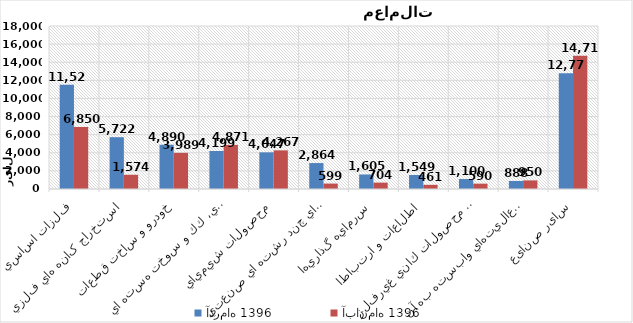
| Category | آذر‌ماه 1396 | آبان‌ماه 1396 |
|---|---|---|
| فلزات اساسي | 11522.234 | 6850.494 |
| استخراج کانه هاي فلزي | 5722.241 | 1573.636 |
| خودرو و ساخت قطعات | 4889.731 | 3989.436 |
| فراورده هاي نفتي، كك و سوخت هسته اي | 4198.873 | 4871.484 |
| محصولات شيميايي | 4047.029 | 4266.772 |
| شرکتهاي چند رشته اي صنعتي | 2864.365 | 598.634 |
| سرمايه گذاريها | 1604.502 | 704.174 |
| اطلاعات و ارتباطات | 1548.641 | 461.483 |
| ساير محصولات كاني غيرفلزي | 1099.518 | 590.011 |
| رايانه و فعاليت‌هاي وابسته به آن | 888.342 | 950.488 |
| سایر صنایع | 12772.081 | 14712.449 |